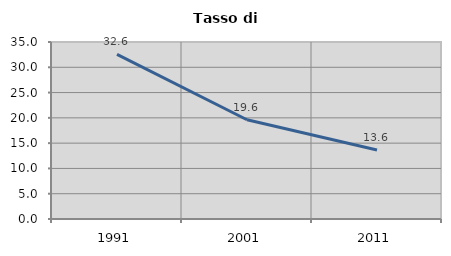
| Category | Tasso di disoccupazione   |
|---|---|
| 1991.0 | 32.564 |
| 2001.0 | 19.623 |
| 2011.0 | 13.629 |